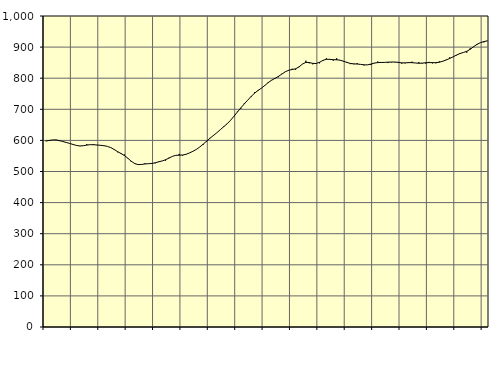
| Category | Piggar | Series 1 |
|---|---|---|
| nan | 598.3 | 597.73 |
| 87.0 | 599.3 | 599.8 |
| 87.0 | 601.6 | 601.44 |
| 87.0 | 602.3 | 601.44 |
| nan | 597.8 | 599.35 |
| 88.0 | 597.2 | 596.42 |
| 88.0 | 592.2 | 593.41 |
| 88.0 | 589.8 | 590.28 |
| nan | 586.1 | 586.9 |
| 89.0 | 583.1 | 583.73 |
| 89.0 | 581.6 | 582.11 |
| 89.0 | 582.5 | 582.89 |
| nan | 587.6 | 584.95 |
| 90.0 | 586.4 | 586.24 |
| 90.0 | 588 | 586.08 |
| 90.0 | 584.8 | 585.22 |
| nan | 584.7 | 584.22 |
| 91.0 | 583.3 | 582.96 |
| 91.0 | 580.8 | 580.83 |
| 91.0 | 576.3 | 576.88 |
| nan | 569.7 | 570.65 |
| 92.0 | 561.8 | 563.82 |
| 92.0 | 556.4 | 557.83 |
| 92.0 | 554.6 | 551.25 |
| nan | 543.5 | 542.61 |
| 93.0 | 530.5 | 532.94 |
| 93.0 | 526.5 | 525.47 |
| 93.0 | 521.6 | 522.25 |
| nan | 523.3 | 522.67 |
| 94.0 | 526.2 | 524.27 |
| 94.0 | 524.9 | 525.11 |
| 94.0 | 524.2 | 525.85 |
| nan | 526.4 | 528.05 |
| 95.0 | 532 | 531.08 |
| 95.0 | 533.9 | 533.89 |
| 95.0 | 535 | 537.7 |
| nan | 544.2 | 543.05 |
| 96.0 | 548.7 | 548.61 |
| 96.0 | 551.6 | 551.94 |
| 96.0 | 556.6 | 552.55 |
| nan | 551.3 | 552.97 |
| 97.0 | 555.7 | 555.3 |
| 97.0 | 559.3 | 559.68 |
| 97.0 | 565.2 | 564.92 |
| nan | 570.7 | 570.93 |
| 98.0 | 578.9 | 578.72 |
| 98.0 | 585.7 | 587.91 |
| 98.0 | 595.9 | 597.51 |
| nan | 608.1 | 607.21 |
| 99.0 | 614.5 | 615.82 |
| 99.0 | 624.8 | 624.74 |
| 99.0 | 634.4 | 634.42 |
| nan | 645.5 | 644.03 |
| 0.0 | 653.7 | 653.53 |
| 0.0 | 664.4 | 664.64 |
| 0.0 | 678.5 | 677.67 |
| nan | 692.6 | 691.25 |
| 1.0 | 701.7 | 704.56 |
| 1.0 | 719 | 717.16 |
| 1.0 | 729.4 | 729.34 |
| nan | 739.3 | 741.11 |
| 2.0 | 754.9 | 751.66 |
| 2.0 | 759.1 | 760.25 |
| 2.0 | 767.5 | 767.85 |
| nan | 775.8 | 776.56 |
| 3.0 | 787.8 | 785.9 |
| 3.0 | 794.4 | 793.52 |
| 3.0 | 798.3 | 799.54 |
| nan | 803.2 | 805.87 |
| 4.0 | 814.2 | 813.28 |
| 4.0 | 821.4 | 820.7 |
| 4.0 | 826.4 | 825.61 |
| nan | 830.4 | 827.93 |
| 5.0 | 827.1 | 830.23 |
| 5.0 | 835.4 | 836.47 |
| 5.0 | 845.8 | 845.36 |
| nan | 856.2 | 850.79 |
| 6.0 | 847.8 | 850.47 |
| 6.0 | 844.7 | 847.64 |
| 6.0 | 847.8 | 847.23 |
| nan | 847.9 | 851.25 |
| 7.0 | 858.4 | 857.22 |
| 7.0 | 864 | 860.79 |
| 7.0 | 859.5 | 860.62 |
| nan | 856.5 | 859.51 |
| 8.0 | 864 | 859.17 |
| 8.0 | 858.4 | 857.94 |
| 8.0 | 853.3 | 854.61 |
| nan | 852.3 | 850.62 |
| 9.0 | 845.2 | 847.44 |
| 9.0 | 844.9 | 846.14 |
| 9.0 | 848.2 | 845.55 |
| nan | 844.4 | 844.45 |
| 10.0 | 841.2 | 842.96 |
| 10.0 | 843.2 | 842.89 |
| 10.0 | 842.2 | 845.38 |
| nan | 849.2 | 848.45 |
| 11.0 | 853.5 | 850.21 |
| 11.0 | 849.5 | 850.63 |
| 11.0 | 851.4 | 850.84 |
| nan | 848.7 | 851.53 |
| 12.0 | 850.9 | 852.08 |
| 12.0 | 851.1 | 851.96 |
| 12.0 | 852.3 | 850.78 |
| nan | 846.9 | 849.37 |
| 13.0 | 847.9 | 849.32 |
| 13.0 | 851.7 | 850.09 |
| 13.0 | 853 | 849.99 |
| nan | 849.1 | 848.9 |
| 14.0 | 851.4 | 848.04 |
| 14.0 | 847.3 | 848.48 |
| 14.0 | 847.1 | 849.71 |
| nan | 852.4 | 850.24 |
| 15.0 | 847.7 | 850.02 |
| 15.0 | 848 | 849.92 |
| 15.0 | 854 | 851.39 |
| nan | 853.9 | 854.53 |
| 16.0 | 859.7 | 858.67 |
| 16.0 | 866.7 | 863.35 |
| 16.0 | 868.7 | 868.54 |
| nan | 873.2 | 874.39 |
| 17.0 | 880.9 | 879.23 |
| 17.0 | 882.9 | 882.59 |
| 17.0 | 882.1 | 886.43 |
| nan | 896.1 | 892.9 |
| 18.0 | 900.1 | 901.27 |
| 18.0 | 907.2 | 908.93 |
| 18.0 | 914.6 | 914.34 |
| nan | 915.3 | 917.66 |
| 19.0 | 919.2 | 920.19 |